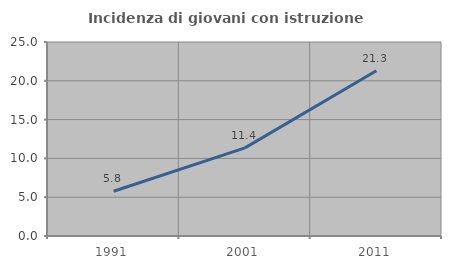
| Category | Incidenza di giovani con istruzione universitaria |
|---|---|
| 1991.0 | 5.761 |
| 2001.0 | 11.357 |
| 2011.0 | 21.3 |